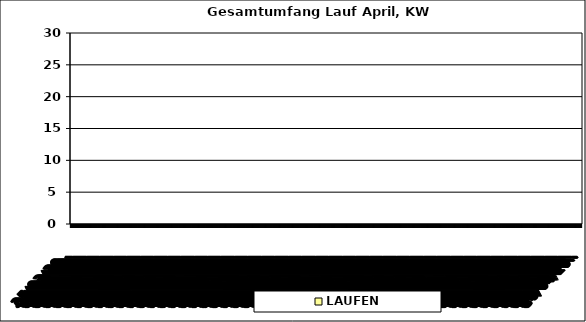
| Category | LAUFEN |
|---|---|
| 27/03/2023 | 0 |
| 28/03/2023 | 0 |
| 29/03/2023 | 0 |
| 30/03/2023 | 0 |
| 31/03/2023 | 0 |
| 01/04/2023 | 0 |
| 02/04/2023 | 0 |
| 03/04/2023 | 0 |
| 04/04/2023 | 0 |
| 05/04/2023 | 0 |
| 06/04/2023 | 0 |
| 07/04/2023 | 0 |
| 08/04/2023 | 0 |
| 09/04/2023 | 0 |
| 10/04/2023 | 0 |
| 11/04/2023 | 0 |
| 12/04/2023 | 0 |
| 13/04/2023 | 0 |
| 14/04/2023 | 0 |
| 15/04/2023 | 0 |
| 16/04/2023 | 0 |
| 17/04/2023 | 0 |
| 18/04/2023 | 0 |
| 19/04/2023 | 0 |
| 20/04/2023 | 0 |
| 21/04/2023 | 0 |
| 22/04/2023 | 0 |
| 23/04/2023 | 0 |
| 24/04/2023 | 0 |
| 25/04/2023 | 0 |
| 26/04/2023 | 0 |
| 27/04/2023 | 0 |
| 28/04/2023 | 0 |
| 29/04/2023 | 0 |
| 30/04/2023 | 0 |